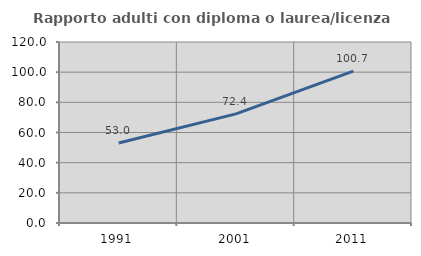
| Category | Rapporto adulti con diploma o laurea/licenza media  |
|---|---|
| 1991.0 | 52.997 |
| 2001.0 | 72.374 |
| 2011.0 | 100.657 |